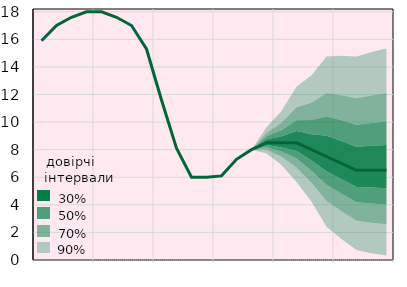
| Category | Облікова ставка, % |
|---|---|
|  | 15.9 |
|  | 17 |
|  | 17.6 |
| IV.18 | 18 |
|  | 18 |
|  | 17.6 |
|  | 17 |
| IV.19 | 15.3 |
|  | 11.6 |
|  | 8.1 |
|  | 6 |
| IV.20 | 6 |
|  | 6.1 |
|  | 7.3 |
|  | 8 |
| IV.21 | 8.5 |
|  | 8.5 |
|  | 8.5 |
|  | 8 |
| IV.22 | 7.5 |
|  | 7 |
|  | 6.5 |
|  | 6.5 |
| IV.23 | 6.5 |